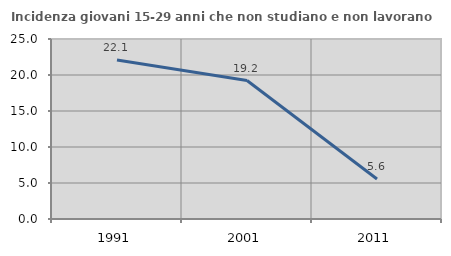
| Category | Incidenza giovani 15-29 anni che non studiano e non lavorano  |
|---|---|
| 1991.0 | 22.093 |
| 2001.0 | 19.231 |
| 2011.0 | 5.556 |